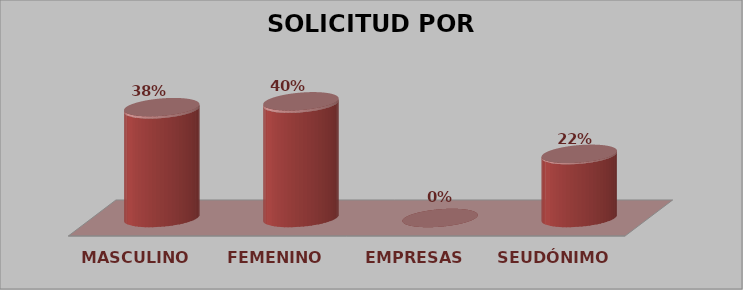
| Category | SOLICITUD POR GÉNERO | Series 1 |
|---|---|---|
| MASCULINO | 19 | 0.38 |
| FEMENINO | 20 | 0.4 |
| EMPRESAS | 0 | 0 |
| SEUDÓNIMO | 11 | 0.22 |